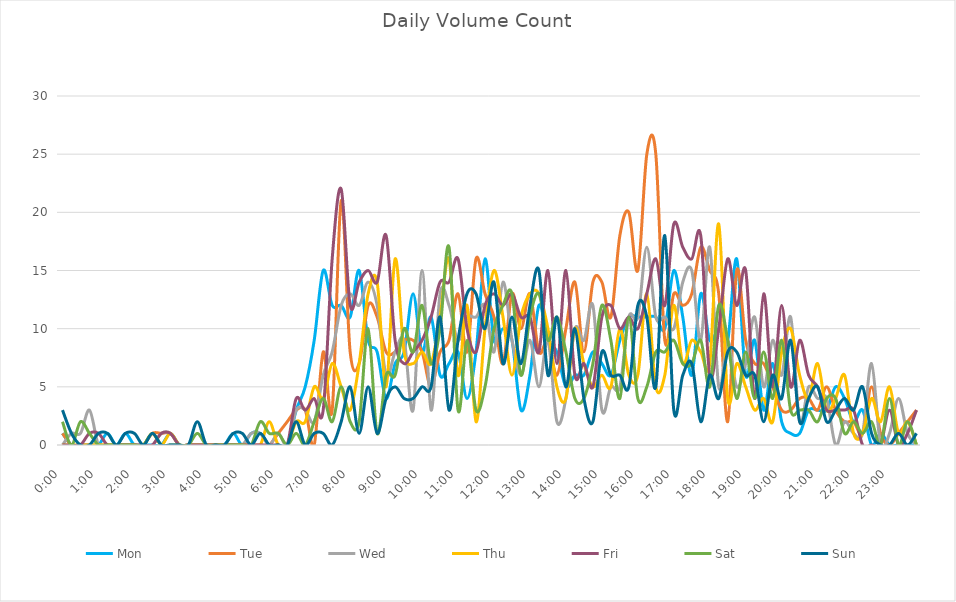
| Category | Mon | Tue | Wed | Thu | Fri | Sat | Sun |
|---|---|---|---|---|---|---|---|
| 0.0 | 1 | 1 | 0 | 0 | 0 | 2 | 3 |
| 0.010416666666666666 | 0 | 0 | 1 | 0 | 0 | 0 | 1 |
| 0.020833333333333332 | 0 | 0 | 1 | 0 | 0 | 2 | 0 |
| 0.03125 | 0 | 0 | 3 | 0 | 1 | 1 | 0 |
| 0.041666666666666664 | 0 | 0 | 0 | 0 | 1 | 0 | 1 |
| 0.05208333333333333 | 1 | 0 | 0 | 0 | 0 | 0 | 1 |
| 0.06249999999999999 | 0 | 0 | 0 | 0 | 0 | 0 | 0 |
| 0.07291666666666666 | 1 | 0 | 0 | 0 | 0 | 0 | 1 |
| 0.08333333333333333 | 0 | 0 | 0 | 0 | 0 | 0 | 1 |
| 0.09375 | 0 | 0 | 0 | 0 | 0 | 0 | 0 |
| 0.10416666666666667 | 0 | 1 | 0 | 1 | 0 | 1 | 1 |
| 0.11458333333333334 | 0 | 1 | 1 | 0 | 1 | 0 | 0 |
| 0.125 | 1 | 1 | 1 | 1 | 1 | 0 | 0 |
| 0.13541666666666666 | 0 | 0 | 0 | 0 | 0 | 0 | 0 |
| 0.14583333333333331 | 0 | 0 | 0 | 0 | 0 | 0 | 0 |
| 0.15624999999999997 | 0 | 0 | 0 | 0 | 0 | 1 | 2 |
| 0.16666666666666663 | 0 | 0 | 0 | 0 | 0 | 0 | 0 |
| 0.1770833333333333 | 0 | 0 | 0 | 0 | 0 | 0 | 0 |
| 0.18749999999999994 | 0 | 0 | 0 | 0 | 0 | 0 | 0 |
| 0.1979166666666666 | 1 | 0 | 0 | 0 | 0 | 0 | 1 |
| 0.20833333333333326 | 0 | 0 | 0 | 0 | 0 | 0 | 1 |
| 0.21874999999999992 | 1 | 0 | 1 | 0 | 0 | 0 | 0 |
| 0.22916666666666657 | 1 | 0 | 1 | 0 | 0 | 2 | 1 |
| 0.23958333333333323 | 0 | 0 | 0 | 2 | 0 | 1 | 0 |
| 0.2499999999999999 | 0 | 1 | 1 | 0 | 0 | 1 | 0 |
| 0.2604166666666666 | 0 | 2 | 0 | 0 | 0 | 0 | 0 |
| 0.27083333333333326 | 3 | 3 | 3 | 2 | 4 | 1 | 2 |
| 0.28124999999999994 | 5 | 3 | 3 | 2 | 3 | 0 | 0 |
| 0.29166666666666663 | 9 | 0 | 2 | 5 | 4 | 2 | 1 |
| 0.3020833333333333 | 15 | 8 | 6 | 4 | 3 | 4 | 1 |
| 0.3125 | 12 | 3 | 8 | 7 | 16 | 2 | 0 |
| 0.3229166666666667 | 12 | 21 | 12 | 5 | 22 | 5 | 2 |
| 0.33333333333333337 | 11 | 8 | 13 | 3 | 12 | 2 | 5 |
| 0.34375000000000006 | 15 | 7 | 12 | 7 | 14 | 2 | 1 |
| 0.35416666666666674 | 9 | 12 | 14 | 13 | 15 | 10 | 5 |
| 0.3645833333333334 | 8 | 11 | 12 | 14 | 14 | 1 | 1 |
| 0.3750000000000001 | 4 | 8 | 6 | 5 | 18 | 6 | 4 |
| 0.3854166666666668 | 7 | 8 | 8 | 16 | 9 | 6 | 5 |
| 0.3958333333333335 | 8 | 9 | 9 | 8 | 7 | 10 | 4 |
| 0.40625000000000017 | 13 | 9 | 3 | 7 | 8 | 8 | 4 |
| 0.41666666666666685 | 8 | 8 | 15 | 8 | 9 | 12 | 5 |
| 0.4270833333333333 | 11 | 5 | 3 | 7 | 11 | 7 | 5 |
| 0.4375000000000002 | 6 | 8 | 13 | 11 | 14 | 10 | 11 |
| 0.4479166666666669 | 7 | 9 | 12 | 16 | 14 | 17 | 3 |
| 0.4583333333333333 | 8 | 13 | 9 | 6 | 16 | 3 | 9 |
| 0.4687500000000003 | 4 | 8 | 11 | 12 | 10 | 9 | 13 |
| 0.47916666666666696 | 8 | 16 | 11 | 2 | 8 | 3 | 13 |
| 0.4895833333333333 | 16 | 13 | 12 | 10 | 12 | 5 | 10 |
| 0.5000000000000003 | 9 | 11 | 8 | 15 | 13 | 10 | 14 |
| 0.510416666666667 | 10 | 7 | 14 | 11 | 12 | 12 | 7 |
| 0.5208333333333334 | 9 | 13 | 9 | 6 | 13 | 13 | 11 |
| 0.5312500000000002 | 3 | 10 | 6 | 11 | 11 | 6 | 7 |
| 0.5416666666666669 | 6 | 13 | 9 | 13 | 11 | 11 | 12 |
| 0.5520833333333335 | 12 | 8 | 5 | 13 | 8 | 13 | 15 |
| 0.5625000000000001 | 9 | 9 | 9 | 10 | 15 | 9 | 6 |
| 0.5729166666666667 | 8 | 6 | 2 | 5 | 7 | 11 | 11 |
| 0.5833333333333334 | 5 | 10 | 4 | 4 | 15 | 8 | 5 |
| 0.59375 | 6 | 14 | 10 | 10 | 6 | 4 | 10 |
| 0.6041666666666666 | 6 | 8 | 9 | 7 | 7 | 4 | 4 |
| 0.6145833333333333 | 8 | 14 | 12 | 5 | 5 | 7 | 2 |
| 0.6249999999999999 | 7 | 14 | 3 | 6 | 11 | 12 | 8 |
| 0.6354166666666665 | 6 | 11 | 5 | 5 | 12 | 9 | 6 |
| 0.6458333333333331 | 9 | 18 | 5 | 10 | 10 | 4 | 6 |
| 0.6562499999999998 | 11 | 20 | 11 | 6 | 11 | 11 | 5 |
| 0.6666666666666666 | 11 | 15 | 11 | 6 | 10 | 4 | 12 |
| 0.677083333333333 | 11 | 25 | 17 | 13 | 13 | 5 | 11 |
| 0.6874999999999997 | 11 | 25 | 11 | 5 | 16 | 8 | 5 |
| 0.6979166666666666 | 10 | 9 | 11 | 6 | 12 | 8 | 18 |
| 0.7083333333333329 | 15 | 13 | 10 | 12 | 19 | 9 | 3 |
| 0.7187499999999996 | 11 | 12 | 14 | 7 | 17 | 7 | 6 |
| 0.7291666666666666 | 6 | 13 | 15 | 9 | 16 | 7 | 7 |
| 0.7395833333333328 | 13 | 17 | 9 | 8 | 18 | 9 | 2 |
| 0.75 | 9 | 15 | 17 | 7 | 6 | 5 | 6 |
| 0.7604166666666666 | 10 | 13 | 5 | 19 | 10 | 12 | 4 |
| 0.7708333333333327 | 9 | 2 | 9 | 4 | 16 | 9 | 8 |
| 0.78125 | 16 | 15 | 5 | 7 | 12 | 4 | 8 |
| 0.7916666666666666 | 6 | 9 | 7 | 5 | 15 | 8 | 6 |
| 0.8020833333333326 | 9 | 7 | 11 | 3 | 4 | 4 | 6 |
| 0.8125 | 3 | 7 | 5 | 4 | 13 | 8 | 2 |
| 0.8229166666666666 | 7 | 5 | 9 | 2 | 5 | 4 | 6 |
| 0.8333333333333334 | 2 | 3 | 6 | 8 | 12 | 9 | 4 |
| 0.84375 | 1 | 3 | 11 | 10 | 5 | 3 | 9 |
| 0.8541666666666666 | 1 | 4 | 2 | 6 | 9 | 3 | 2 |
| 0.8645833333333334 | 3 | 4 | 5 | 4 | 6 | 3 | 4 |
| 0.875 | 3 | 3 | 4 | 7 | 5 | 2 | 5 |
| 0.8854166666666666 | 3 | 5 | 4 | 3 | 3 | 4 | 2 |
| 0.8958333333333334 | 5 | 3 | 0 | 4 | 3 | 4 | 3 |
| 0.90625 | 4 | 2 | 2 | 6 | 3 | 1 | 4 |
| 0.9166666666666666 | 2 | 2 | 1 | 1 | 3 | 2 | 3 |
| 0.9270833333333334 | 3 | 1 | 1 | 1 | 0 | 1 | 5 |
| 0.9375 | 0 | 5 | 7 | 4 | 0 | 2 | 1 |
| 0.9479166666666666 | 1 | 1 | 0 | 2 | 0 | 0 | 0 |
| 0.9583333333333334 | 0 | 0 | 1 | 5 | 3 | 4 | 0 |
| 0.96875 | 0 | 1 | 4 | 1 | 0 | 0 | 1 |
| 0.9791666666666666 | 0 | 2 | 1 | 2 | 1 | 2 | 0 |
| 0.9895833333333334 | 0 | 3 | 0 | 0 | 3 | 0 | 1 |